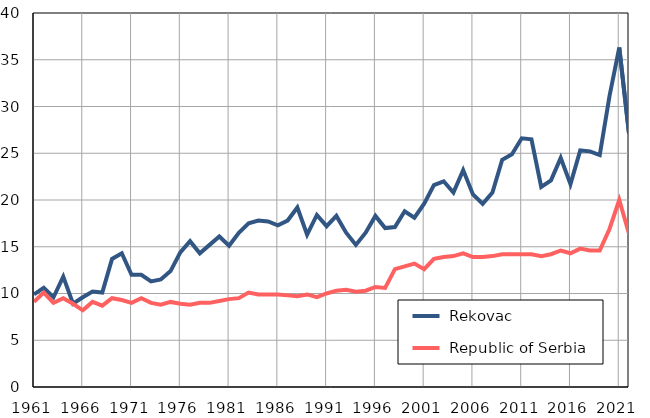
| Category |  Rekovac |  Republic of Serbia |
|---|---|---|
| 1961.0 | 9.9 | 9.1 |
| 1962.0 | 10.6 | 10.1 |
| 1963.0 | 9.6 | 9 |
| 1964.0 | 11.8 | 9.5 |
| 1965.0 | 8.9 | 8.9 |
| 1966.0 | 9.6 | 8.2 |
| 1967.0 | 10.2 | 9.1 |
| 1968.0 | 10.1 | 8.7 |
| 1969.0 | 13.7 | 9.5 |
| 1970.0 | 14.3 | 9.3 |
| 1971.0 | 12 | 9 |
| 1972.0 | 12 | 9.5 |
| 1973.0 | 11.3 | 9 |
| 1974.0 | 11.5 | 8.8 |
| 1975.0 | 12.4 | 9.1 |
| 1976.0 | 14.4 | 8.9 |
| 1977.0 | 15.6 | 8.8 |
| 1978.0 | 14.3 | 9 |
| 1979.0 | 15.2 | 9 |
| 1980.0 | 16.1 | 9.2 |
| 1981.0 | 15.1 | 9.4 |
| 1982.0 | 16.5 | 9.5 |
| 1983.0 | 17.5 | 10.1 |
| 1984.0 | 17.8 | 9.9 |
| 1985.0 | 17.7 | 9.9 |
| 1986.0 | 17.3 | 9.9 |
| 1987.0 | 17.8 | 9.8 |
| 1988.0 | 19.2 | 9.7 |
| 1989.0 | 16.3 | 9.9 |
| 1990.0 | 18.4 | 9.6 |
| 1991.0 | 17.2 | 10 |
| 1992.0 | 18.3 | 10.3 |
| 1993.0 | 16.5 | 10.4 |
| 1994.0 | 15.2 | 10.2 |
| 1995.0 | 16.5 | 10.3 |
| 1996.0 | 18.3 | 10.7 |
| 1997.0 | 17 | 10.6 |
| 1998.0 | 17.1 | 12.6 |
| 1999.0 | 18.8 | 12.9 |
| 2000.0 | 18.1 | 13.2 |
| 2001.0 | 19.6 | 12.6 |
| 2002.0 | 21.6 | 13.7 |
| 2003.0 | 22 | 13.9 |
| 2004.0 | 20.8 | 14 |
| 2005.0 | 23.2 | 14.3 |
| 2006.0 | 20.6 | 13.9 |
| 2007.0 | 19.6 | 13.9 |
| 2008.0 | 20.8 | 14 |
| 2009.0 | 24.3 | 14.2 |
| 2010.0 | 24.9 | 14.2 |
| 2011.0 | 26.6 | 14.2 |
| 2012.0 | 26.5 | 14.2 |
| 2013.0 | 21.4 | 14 |
| 2014.0 | 22.1 | 14.2 |
| 2015.0 | 24.5 | 14.6 |
| 2016.0 | 21.7 | 14.3 |
| 2017.0 | 25.3 | 14.8 |
| 2018.0 | 25.2 | 14.6 |
| 2019.0 | 24.8 | 14.6 |
| 2020.0 | 31.1 | 16.9 |
| 2021.0 | 36.3 | 20 |
| 2022.0 | 27.1 | 16.4 |